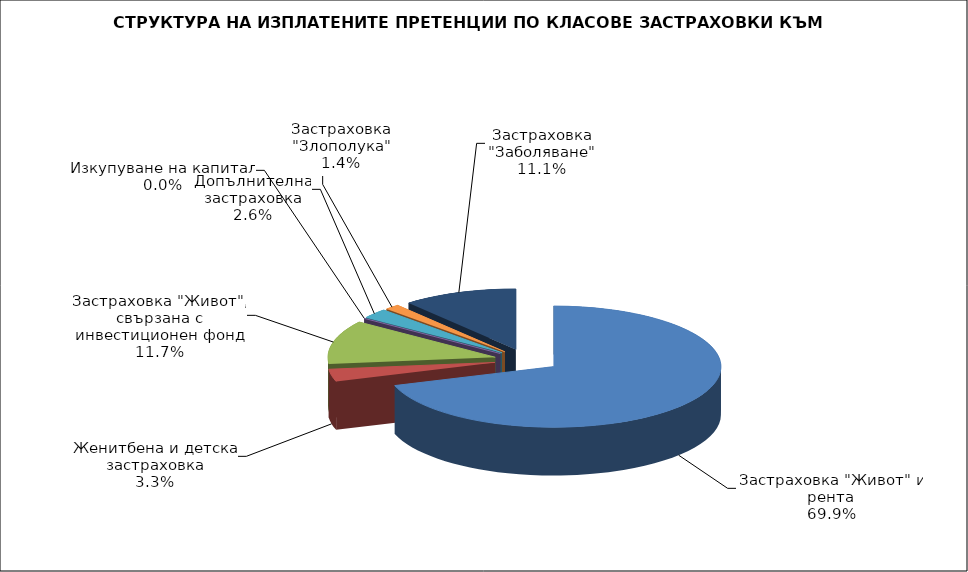
| Category | 37 420 518 |
|---|---|
| Застраховка "Живот" и рента | 37420518.143 |
| Женитбена и детска застраховка | 1749773.009 |
| Застраховка "Живот", свързана с инвестиционен фонд | 6247726.042 |
| Изкупуване на капитал | 0 |
| Допълнителна застраховка | 1399605.935 |
| Застраховка "Злополука" | 768704.82 |
| Застраховка "Заболяване" | 5924079.675 |